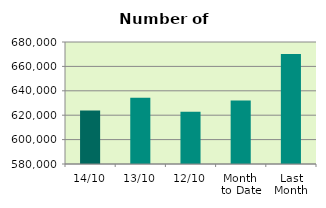
| Category | Series 0 |
|---|---|
| 14/10 | 623836 |
| 13/10 | 634298 |
| 12/10 | 622900 |
| Month 
to Date | 632058.6 |
| Last
Month | 670189.636 |